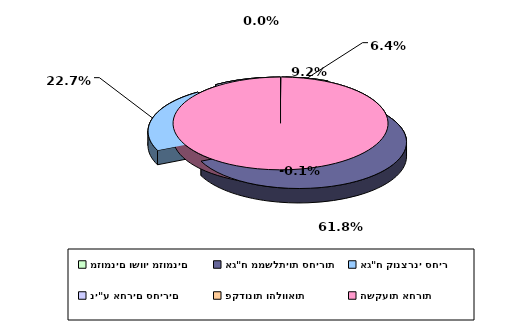
| Category | Series 0 |
|---|---|
| מזומנים ושווי מזומנים | 0.064 |
| אג"ח ממשלתיות סחירות | 0.618 |
| אג"ח קונצרני סחיר | 0.227 |
| ני"ע אחרים סחירים | 0.092 |
| פקדונות והלוואות | 0 |
| השקעות אחרות | -0.001 |